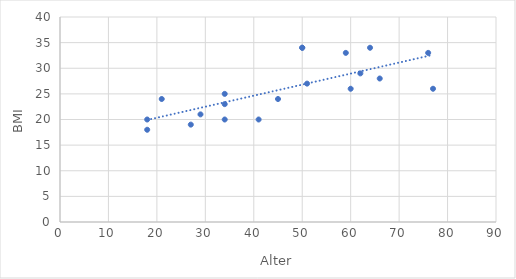
| Category | BMI |
|---|---|
| 64.0 | 34 |
| 77.0 | 26 |
| 34.0 | 25 |
| 18.0 | 20 |
| 60.0 | 26 |
| 29.0 | 21 |
| 51.0 | 27 |
| 59.0 | 33 |
| 66.0 | 28 |
| 50.0 | 34 |
| 34.0 | 23 |
| 18.0 | 18 |
| 62.0 | 29 |
| 41.0 | 20 |
| 21.0 | 24 |
| 76.0 | 33 |
| 34.0 | 20 |
| 50.0 | 34 |
| 27.0 | 19 |
| 45.0 | 24 |